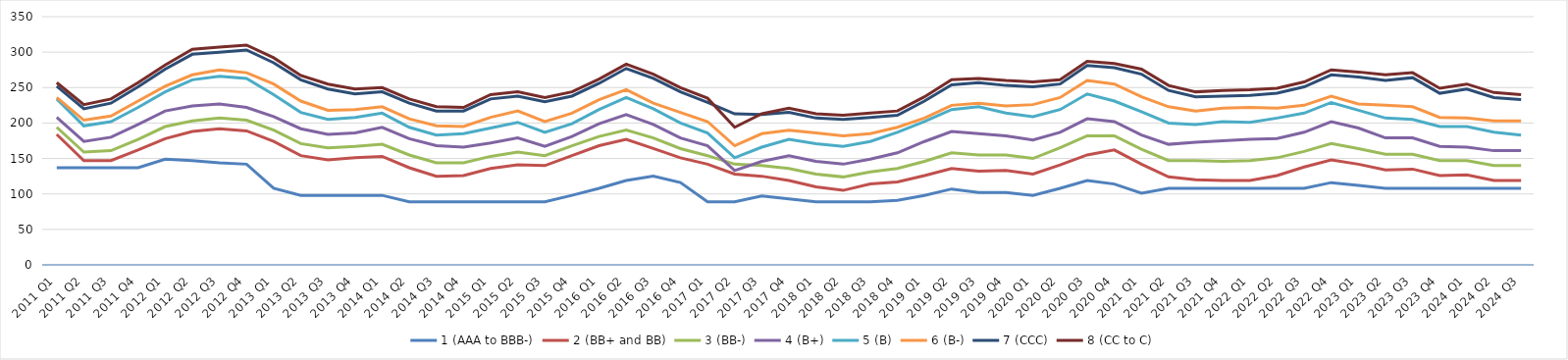
| Category | 1 (AAA to BBB-) | 2 (BB+ and BB) | 3 (BB-) | 4 (B+) | 5 (B) | 6 (B-) | 7 (CCC) | 8 (CC to C) |
|---|---|---|---|---|---|---|---|---|
| 2011 Q1 | 137 | 184 | 194 | 208 | 234 | 236 | 252 | 257 |
| 2011 Q2 | 137 | 147 | 159 | 174 | 196 | 204 | 220 | 226 |
| 2011 Q3 | 137 | 147 | 161 | 180 | 202 | 210 | 228 | 234 |
| 2011 Q4 | 137 | 162 | 177 | 198 | 222 | 231 | 251 | 257 |
| 2012 Q1 | 149 | 178 | 195 | 217 | 244 | 252 | 276 | 282 |
| 2012 Q2 | 147 | 188 | 203 | 224 | 261 | 268 | 297 | 304 |
| 2012 Q3 | 144 | 192 | 207 | 227 | 266 | 275 | 300 | 307 |
| 2012 Q4 | 142 | 189 | 204 | 222 | 263 | 271 | 303 | 310 |
| 2013 Q1 | 108 | 174 | 190 | 209 | 240 | 255 | 285 | 292 |
| 2013 Q2 | 98 | 154 | 171 | 192 | 215 | 231 | 261 | 267 |
| 2013 Q3 | 98 | 148 | 165 | 184 | 205 | 218 | 248 | 255 |
| 2013 Q4 | 98 | 151 | 167 | 186 | 208 | 219 | 241 | 248 |
| 2014 Q1 | 98 | 153 | 170 | 194 | 214 | 223 | 244 | 250 |
| 2014 Q2 | 89 | 137 | 155 | 178 | 194 | 206 | 228 | 234 |
| 2014 Q3 | 89 | 125 | 144 | 168 | 183 | 196 | 217 | 223 |
| 2014 Q4 | 89 | 126 | 144 | 166 | 185 | 195 | 217 | 222 |
| 2015 Q1 | 89 | 136 | 153 | 172 | 193 | 208 | 234 | 240 |
| 2015 Q2 | 89 | 141 | 159 | 179 | 201 | 217 | 238 | 244 |
| 2015 Q3 | 89 | 140 | 154 | 167 | 187 | 202 | 230 | 236 |
| 2015 Q4 | 98 | 154 | 168 | 181 | 199 | 214 | 238 | 244 |
| 2016 Q1 | 108 | 168 | 181 | 199 | 219 | 233 | 256 | 262 |
| 2016 Q2 | 119 | 177 | 190 | 212 | 236 | 247 | 277 | 283 |
| 2016 Q3 | 125 | 164 | 179 | 198 | 220 | 228 | 263 | 269 |
| 2016 Q4 | 116 | 151 | 164 | 179 | 200 | 215 | 244 | 250 |
| 2017 Q1 | 89 | 142 | 154 | 168 | 186 | 202 | 229 | 235 |
| 2017 Q2 | 89 | 128 | 142 | 133 | 151 | 168 | 213 | 194 |
| 2017 Q3 | 97 | 125 | 140 | 146 | 166 | 185 | 212 | 213 |
| 2017 Q4 | 93 | 119 | 136 | 154 | 177 | 190 | 215 | 221 |
| 2018 Q1 | 89 | 110 | 128 | 146 | 171 | 186 | 207 | 213 |
| 2018 Q2 | 89 | 105 | 124 | 142 | 167 | 182 | 205 | 211 |
| 2018 Q3 | 89 | 114 | 131 | 149 | 174 | 185 | 208 | 214 |
| 2018 Q4 | 91 | 117 | 136 | 158 | 187 | 194 | 211 | 217 |
| 2019 Q1 | 98 | 126 | 146 | 174 | 202 | 207 | 231 | 237 |
| 2019 Q2 | 107 | 136 | 158 | 188 | 219 | 225 | 254 | 261 |
| 2019 Q3 | 102 | 132 | 155 | 185 | 223 | 228 | 257 | 263 |
| 2019 Q4 | 102 | 133 | 155 | 182 | 214 | 224 | 253 | 260 |
| 2020 Q1 | 98 | 128 | 150 | 176 | 209 | 226 | 251 | 258 |
| 2020 Q2 | 108 | 141 | 165 | 187 | 219 | 236 | 255 | 261 |
| 2020 Q3 | 119 | 155 | 182 | 206 | 241 | 260 | 281 | 287 |
| 2020 Q4 | 114 | 162 | 182 | 202 | 231 | 255 | 278 | 284 |
| 2021 Q1 | 101 | 142 | 163 | 183 | 216 | 237 | 269 | 276 |
| 2021 Q2 | 108 | 124 | 147 | 170 | 200 | 223 | 246 | 253 |
| 2021 Q3 | 108 | 120 | 147 | 173 | 198 | 217 | 237 | 244 |
| 2021 Q4 | 108 | 119 | 146 | 175 | 202 | 221 | 238 | 246 |
| 2022 Q1 | 108 | 119 | 147 | 177 | 201 | 222 | 239 | 247 |
| 2022 Q2 | 108 | 126 | 151 | 178 | 207 | 221 | 242 | 249 |
| 2022 Q3 | 108 | 138 | 160 | 187 | 214 | 225 | 251 | 258 |
| 2022 Q4 | 116 | 148 | 171 | 202 | 229 | 238 | 268 | 275 |
| 2023 Q1 | 112 | 142 | 164 | 193 | 218 | 227 | 265 | 272 |
| 2023 Q2 | 108 | 134 | 156 | 179 | 207 | 225 | 260 | 268 |
| 2023 Q3 | 108 | 135 | 156 | 179 | 205 | 223 | 264 | 271 |
| 2023 Q4 | 108 | 126 | 147 | 167 | 195 | 208 | 242 | 249 |
| 2024 Q1 | 108 | 127 | 147 | 166 | 195 | 207 | 248 | 255 |
| 2024 Q2 | 108 | 119 | 140 | 161 | 187 | 203 | 236 | 243 |
| 2024 Q3 | 108 | 119 | 140 | 161 | 183 | 203 | 233 | 240 |